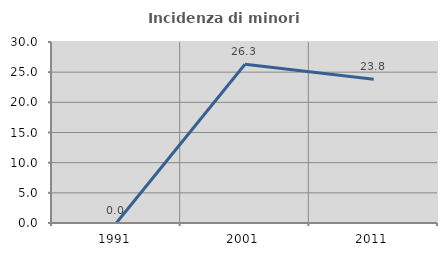
| Category | Incidenza di minori stranieri |
|---|---|
| 1991.0 | 0 |
| 2001.0 | 26.316 |
| 2011.0 | 23.81 |